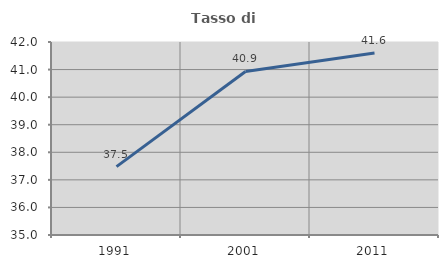
| Category | Tasso di occupazione   |
|---|---|
| 1991.0 | 37.481 |
| 2001.0 | 40.932 |
| 2011.0 | 41.6 |